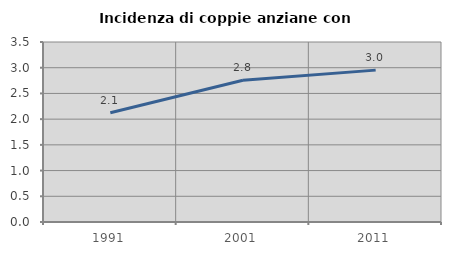
| Category | Incidenza di coppie anziane con figli |
|---|---|
| 1991.0 | 2.123 |
| 2001.0 | 2.756 |
| 2011.0 | 2.953 |